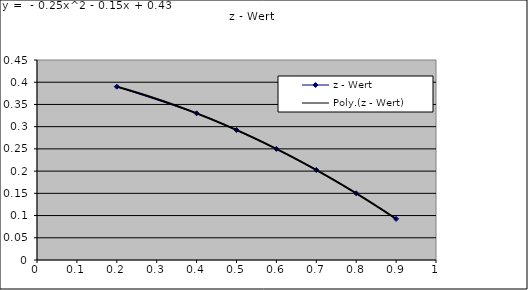
| Category | z - Wert |
|---|---|
| 0.2 | 0.39 |
| 0.4 | 0.33 |
| 0.5 | 0.292 |
| 0.6 | 0.25 |
| 0.7 | 0.202 |
| 0.8 | 0.15 |
| 0.9 | 0.092 |